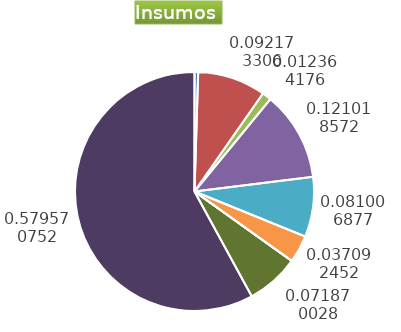
| Category | Series 0 |
|---|---|
| Control arvenses | 55858 |
| Control fitosanitario | 1049916 |
| Cosecha y beneficio | 140836.282 |
| Fertilización | 1378483 |
| Instalación | 922722.862 |
| Otros | 422508 |
| Podas | 0 |
| Riego | 0 |
| Transporte | 818648 |
| Tutorado | 6601701 |